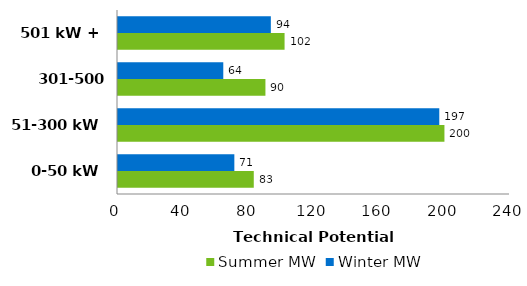
| Category | Summer MW | Winter MW |
|---|---|---|
| 0-50 kW | 83.127 | 71.232 |
| 51-300 kW | 199.861 | 196.704 |
| 301-500 kW | 90.264 | 64.46 |
| 501 kW + | 101.983 | 93.577 |